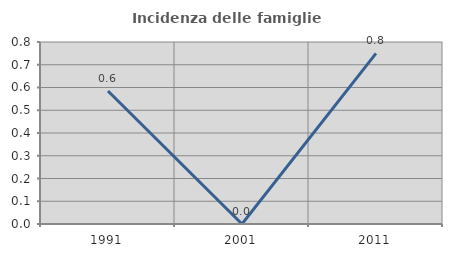
| Category | Incidenza delle famiglie numerose |
|---|---|
| 1991.0 | 0.585 |
| 2001.0 | 0 |
| 2011.0 | 0.75 |